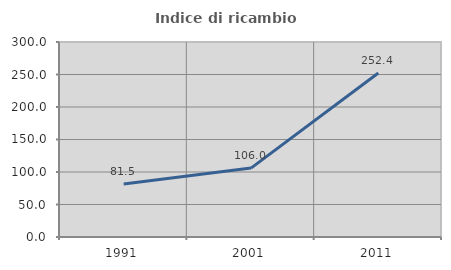
| Category | Indice di ricambio occupazionale  |
|---|---|
| 1991.0 | 81.522 |
| 2001.0 | 106 |
| 2011.0 | 252.381 |